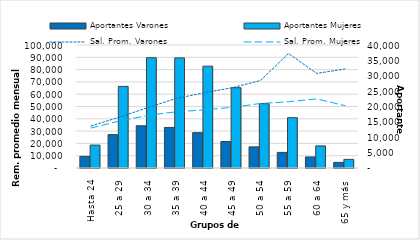
| Category | Aportantes Varones | Aportantes Mujeres |
|---|---|---|
| Hasta 24 | 3789 | 7459 |
| 25 a 29 | 10863 | 26534 |
| 30 a 34 | 13744 | 35864 |
| 35 a 39 | 13185 | 35810 |
| 40 a 44 | 11496 | 33117 |
| 45 a 49 | 8610 | 26118 |
| 50 a 54 | 6879 | 20939 |
| 55 a 59 | 5075 | 16359 |
| 60 a 64 | 3593 | 7186 |
| 65 y más | 1824 | 2809 |